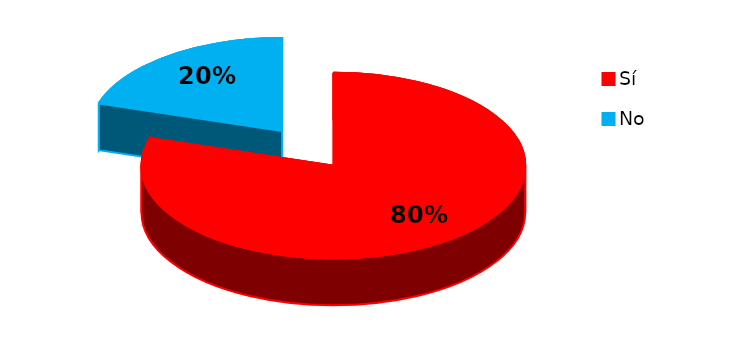
| Category | Series 0 |
|---|---|
| 0 | 75 |
| 1 | 19 |